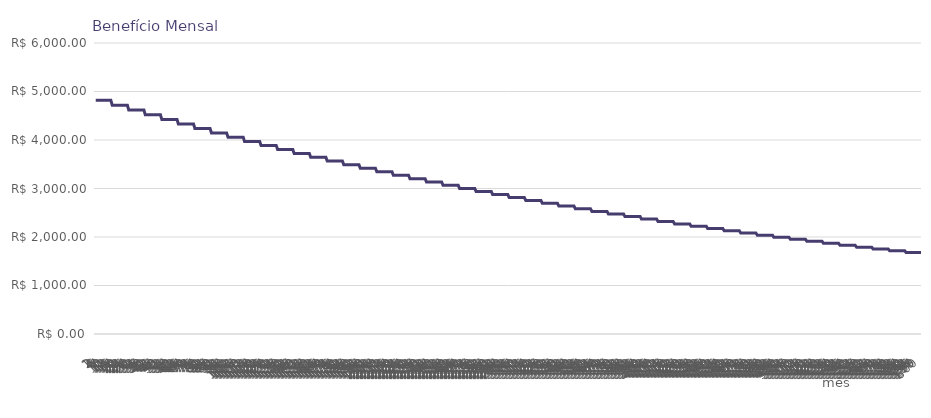
| Category | Series 0 |
|---|---|
| 0 | 4819.606 |
| 1 | 4819.606 |
| 2 | 4819.606 |
| 3 | 4819.606 |
| 4 | 4819.606 |
| 5 | 4819.606 |
| 6 | 4819.606 |
| 7 | 4819.606 |
| 8 | 4819.606 |
| 9 | 4819.606 |
| 10 | 4819.606 |
| 11 | 4819.606 |
| 12 | 4716.986 |
| 13 | 4716.986 |
| 14 | 4716.986 |
| 15 | 4716.986 |
| 16 | 4716.986 |
| 17 | 4716.986 |
| 18 | 4716.986 |
| 19 | 4716.986 |
| 20 | 4716.986 |
| 21 | 4716.986 |
| 22 | 4716.986 |
| 23 | 4716.986 |
| 24 | 4616.551 |
| 25 | 4616.551 |
| 26 | 4616.551 |
| 27 | 4616.551 |
| 28 | 4616.551 |
| 29 | 4616.551 |
| 30 | 4616.551 |
| 31 | 4616.551 |
| 32 | 4616.551 |
| 33 | 4616.551 |
| 34 | 4616.551 |
| 35 | 4616.551 |
| 36 | 4518.254 |
| 37 | 4518.254 |
| 38 | 4518.254 |
| 39 | 4518.254 |
| 40 | 4518.254 |
| 41 | 4518.254 |
| 42 | 4518.254 |
| 43 | 4518.254 |
| 44 | 4518.254 |
| 45 | 4518.254 |
| 46 | 4518.254 |
| 47 | 4518.254 |
| 48 | 4422.051 |
| 49 | 4422.051 |
| 50 | 4422.051 |
| 51 | 4422.051 |
| 52 | 4422.051 |
| 53 | 4422.051 |
| 54 | 4422.051 |
| 55 | 4422.051 |
| 56 | 4422.051 |
| 57 | 4422.051 |
| 58 | 4422.051 |
| 59 | 4422.051 |
| 60 | 4327.895 |
| 61 | 4327.895 |
| 62 | 4327.895 |
| 63 | 4327.895 |
| 64 | 4327.895 |
| 65 | 4327.895 |
| 66 | 4327.895 |
| 67 | 4327.895 |
| 68 | 4327.895 |
| 69 | 4327.895 |
| 70 | 4327.895 |
| 71 | 4327.895 |
| 72 | 4235.745 |
| 73 | 4235.745 |
| 74 | 4235.745 |
| 75 | 4235.745 |
| 76 | 4235.745 |
| 77 | 4235.745 |
| 78 | 4235.745 |
| 79 | 4235.745 |
| 80 | 4235.745 |
| 81 | 4235.745 |
| 82 | 4235.745 |
| 83 | 4235.745 |
| 84 | 4145.557 |
| 85 | 4145.557 |
| 86 | 4145.557 |
| 87 | 4145.557 |
| 88 | 4145.557 |
| 89 | 4145.557 |
| 90 | 4145.557 |
| 91 | 4145.557 |
| 92 | 4145.557 |
| 93 | 4145.557 |
| 94 | 4145.557 |
| 95 | 4145.557 |
| 96 | 4057.288 |
| 97 | 4057.288 |
| 98 | 4057.288 |
| 99 | 4057.288 |
| 100 | 4057.288 |
| 101 | 4057.288 |
| 102 | 4057.288 |
| 103 | 4057.288 |
| 104 | 4057.288 |
| 105 | 4057.288 |
| 106 | 4057.288 |
| 107 | 4057.288 |
| 108 | 3970.9 |
| 109 | 3970.9 |
| 110 | 3970.9 |
| 111 | 3970.9 |
| 112 | 3970.9 |
| 113 | 3970.9 |
| 114 | 3970.9 |
| 115 | 3970.9 |
| 116 | 3970.9 |
| 117 | 3970.9 |
| 118 | 3970.9 |
| 119 | 3970.9 |
| 120 | 3886.351 |
| 121 | 3886.351 |
| 122 | 3886.351 |
| 123 | 3886.351 |
| 124 | 3886.351 |
| 125 | 3886.351 |
| 126 | 3886.351 |
| 127 | 3886.351 |
| 128 | 3886.351 |
| 129 | 3886.351 |
| 130 | 3886.351 |
| 131 | 3886.351 |
| 132 | 3803.602 |
| 133 | 3803.602 |
| 134 | 3803.602 |
| 135 | 3803.602 |
| 136 | 3803.602 |
| 137 | 3803.602 |
| 138 | 3803.602 |
| 139 | 3803.602 |
| 140 | 3803.602 |
| 141 | 3803.602 |
| 142 | 3803.602 |
| 143 | 3803.602 |
| 144 | 3722.614 |
| 145 | 3722.614 |
| 146 | 3722.614 |
| 147 | 3722.614 |
| 148 | 3722.614 |
| 149 | 3722.614 |
| 150 | 3722.614 |
| 151 | 3722.614 |
| 152 | 3722.614 |
| 153 | 3722.614 |
| 154 | 3722.614 |
| 155 | 3722.614 |
| 156 | 3643.352 |
| 157 | 3643.352 |
| 158 | 3643.352 |
| 159 | 3643.352 |
| 160 | 3643.352 |
| 161 | 3643.352 |
| 162 | 3643.352 |
| 163 | 3643.352 |
| 164 | 3643.352 |
| 165 | 3643.352 |
| 166 | 3643.352 |
| 167 | 3643.352 |
| 168 | 3565.777 |
| 169 | 3565.777 |
| 170 | 3565.777 |
| 171 | 3565.777 |
| 172 | 3565.777 |
| 173 | 3565.777 |
| 174 | 3565.777 |
| 175 | 3565.777 |
| 176 | 3565.777 |
| 177 | 3565.777 |
| 178 | 3565.777 |
| 179 | 3565.777 |
| 180 | 3489.854 |
| 181 | 3489.854 |
| 182 | 3489.854 |
| 183 | 3489.854 |
| 184 | 3489.854 |
| 185 | 3489.854 |
| 186 | 3489.854 |
| 187 | 3489.854 |
| 188 | 3489.854 |
| 189 | 3489.854 |
| 190 | 3489.854 |
| 191 | 3489.854 |
| 192 | 3415.547 |
| 193 | 3415.547 |
| 194 | 3415.547 |
| 195 | 3415.547 |
| 196 | 3415.547 |
| 197 | 3415.547 |
| 198 | 3415.547 |
| 199 | 3415.547 |
| 200 | 3415.547 |
| 201 | 3415.547 |
| 202 | 3415.547 |
| 203 | 3415.547 |
| 204 | 3342.822 |
| 205 | 3342.822 |
| 206 | 3342.822 |
| 207 | 3342.822 |
| 208 | 3342.822 |
| 209 | 3342.822 |
| 210 | 3342.822 |
| 211 | 3342.822 |
| 212 | 3342.822 |
| 213 | 3342.822 |
| 214 | 3342.822 |
| 215 | 3342.822 |
| 216 | 3271.646 |
| 217 | 3271.646 |
| 218 | 3271.646 |
| 219 | 3271.646 |
| 220 | 3271.646 |
| 221 | 3271.646 |
| 222 | 3271.646 |
| 223 | 3271.646 |
| 224 | 3271.646 |
| 225 | 3271.646 |
| 226 | 3271.646 |
| 227 | 3271.646 |
| 228 | 3201.986 |
| 229 | 3201.986 |
| 230 | 3201.986 |
| 231 | 3201.986 |
| 232 | 3201.986 |
| 233 | 3201.986 |
| 234 | 3201.986 |
| 235 | 3201.986 |
| 236 | 3201.986 |
| 237 | 3201.986 |
| 238 | 3201.986 |
| 239 | 3201.986 |
| 240 | 3133.808 |
| 241 | 3133.808 |
| 242 | 3133.808 |
| 243 | 3133.808 |
| 244 | 3133.808 |
| 245 | 3133.808 |
| 246 | 3133.808 |
| 247 | 3133.808 |
| 248 | 3133.808 |
| 249 | 3133.808 |
| 250 | 3133.808 |
| 251 | 3133.808 |
| 252 | 3067.083 |
| 253 | 3067.083 |
| 254 | 3067.083 |
| 255 | 3067.083 |
| 256 | 3067.083 |
| 257 | 3067.083 |
| 258 | 3067.083 |
| 259 | 3067.083 |
| 260 | 3067.083 |
| 261 | 3067.083 |
| 262 | 3067.083 |
| 263 | 3067.083 |
| 264 | 3001.778 |
| 265 | 3001.778 |
| 266 | 3001.778 |
| 267 | 3001.778 |
| 268 | 3001.778 |
| 269 | 3001.778 |
| 270 | 3001.778 |
| 271 | 3001.778 |
| 272 | 3001.778 |
| 273 | 3001.778 |
| 274 | 3001.778 |
| 275 | 3001.778 |
| 276 | 2937.863 |
| 277 | 2937.863 |
| 278 | 2937.863 |
| 279 | 2937.863 |
| 280 | 2937.863 |
| 281 | 2937.863 |
| 282 | 2937.863 |
| 283 | 2937.863 |
| 284 | 2937.863 |
| 285 | 2937.863 |
| 286 | 2937.863 |
| 287 | 2937.863 |
| 288 | 2875.31 |
| 289 | 2875.31 |
| 290 | 2875.31 |
| 291 | 2875.31 |
| 292 | 2875.31 |
| 293 | 2875.31 |
| 294 | 2875.31 |
| 295 | 2875.31 |
| 296 | 2875.31 |
| 297 | 2875.31 |
| 298 | 2875.31 |
| 299 | 2875.31 |
| 300 | 2814.088 |
| 301 | 2814.088 |
| 302 | 2814.088 |
| 303 | 2814.088 |
| 304 | 2814.088 |
| 305 | 2814.088 |
| 306 | 2814.088 |
| 307 | 2814.088 |
| 308 | 2814.088 |
| 309 | 2814.088 |
| 310 | 2814.088 |
| 311 | 2814.088 |
| 312 | 2754.17 |
| 313 | 2754.17 |
| 314 | 2754.17 |
| 315 | 2754.17 |
| 316 | 2754.17 |
| 317 | 2754.17 |
| 318 | 2754.17 |
| 319 | 2754.17 |
| 320 | 2754.17 |
| 321 | 2754.17 |
| 322 | 2754.17 |
| 323 | 2754.17 |
| 324 | 2695.527 |
| 325 | 2695.527 |
| 326 | 2695.527 |
| 327 | 2695.527 |
| 328 | 2695.527 |
| 329 | 2695.527 |
| 330 | 2695.527 |
| 331 | 2695.527 |
| 332 | 2695.527 |
| 333 | 2695.527 |
| 334 | 2695.527 |
| 335 | 2695.527 |
| 336 | 2638.134 |
| 337 | 2638.134 |
| 338 | 2638.134 |
| 339 | 2638.134 |
| 340 | 2638.134 |
| 341 | 2638.134 |
| 342 | 2638.134 |
| 343 | 2638.134 |
| 344 | 2638.134 |
| 345 | 2638.134 |
| 346 | 2638.134 |
| 347 | 2638.134 |
| 348 | 2581.962 |
| 349 | 2581.962 |
| 350 | 2581.962 |
| 351 | 2581.962 |
| 352 | 2581.962 |
| 353 | 2581.962 |
| 354 | 2581.962 |
| 355 | 2581.962 |
| 356 | 2581.962 |
| 357 | 2581.962 |
| 358 | 2581.962 |
| 359 | 2581.962 |
| 360 | 2526.986 |
| 361 | 2526.986 |
| 362 | 2526.986 |
| 363 | 2526.986 |
| 364 | 2526.986 |
| 365 | 2526.986 |
| 366 | 2526.986 |
| 367 | 2526.986 |
| 368 | 2526.986 |
| 369 | 2526.986 |
| 370 | 2526.986 |
| 371 | 2526.986 |
| 372 | 2473.181 |
| 373 | 2473.181 |
| 374 | 2473.181 |
| 375 | 2473.181 |
| 376 | 2473.181 |
| 377 | 2473.181 |
| 378 | 2473.181 |
| 379 | 2473.181 |
| 380 | 2473.181 |
| 381 | 2473.181 |
| 382 | 2473.181 |
| 383 | 2473.181 |
| 384 | 2420.522 |
| 385 | 2420.522 |
| 386 | 2420.522 |
| 387 | 2420.522 |
| 388 | 2420.522 |
| 389 | 2420.522 |
| 390 | 2420.522 |
| 391 | 2420.522 |
| 392 | 2420.522 |
| 393 | 2420.522 |
| 394 | 2420.522 |
| 395 | 2420.522 |
| 396 | 2368.983 |
| 397 | 2368.983 |
| 398 | 2368.983 |
| 399 | 2368.983 |
| 400 | 2368.983 |
| 401 | 2368.983 |
| 402 | 2368.983 |
| 403 | 2368.983 |
| 404 | 2368.983 |
| 405 | 2368.983 |
| 406 | 2368.983 |
| 407 | 2368.983 |
| 408 | 2318.542 |
| 409 | 2318.542 |
| 410 | 2318.542 |
| 411 | 2318.542 |
| 412 | 2318.542 |
| 413 | 2318.542 |
| 414 | 2318.542 |
| 415 | 2318.542 |
| 416 | 2318.542 |
| 417 | 2318.542 |
| 418 | 2318.542 |
| 419 | 2318.542 |
| 420 | 2269.176 |
| 421 | 2269.176 |
| 422 | 2269.176 |
| 423 | 2269.176 |
| 424 | 2269.176 |
| 425 | 2269.176 |
| 426 | 2269.176 |
| 427 | 2269.176 |
| 428 | 2269.176 |
| 429 | 2269.176 |
| 430 | 2269.176 |
| 431 | 2269.176 |
| 432 | 2220.86 |
| 433 | 2220.86 |
| 434 | 2220.86 |
| 435 | 2220.86 |
| 436 | 2220.86 |
| 437 | 2220.86 |
| 438 | 2220.86 |
| 439 | 2220.86 |
| 440 | 2220.86 |
| 441 | 2220.86 |
| 442 | 2220.86 |
| 443 | 2220.86 |
| 444 | 2173.573 |
| 445 | 2173.573 |
| 446 | 2173.573 |
| 447 | 2173.573 |
| 448 | 2173.573 |
| 449 | 2173.573 |
| 450 | 2173.573 |
| 451 | 2173.573 |
| 452 | 2173.573 |
| 453 | 2173.573 |
| 454 | 2173.573 |
| 455 | 2173.573 |
| 456 | 2127.293 |
| 457 | 2127.293 |
| 458 | 2127.293 |
| 459 | 2127.293 |
| 460 | 2127.293 |
| 461 | 2127.293 |
| 462 | 2127.293 |
| 463 | 2127.293 |
| 464 | 2127.293 |
| 465 | 2127.293 |
| 466 | 2127.293 |
| 467 | 2127.293 |
| 468 | 2081.998 |
| 469 | 2081.998 |
| 470 | 2081.998 |
| 471 | 2081.998 |
| 472 | 2081.998 |
| 473 | 2081.998 |
| 474 | 2081.998 |
| 475 | 2081.998 |
| 476 | 2081.998 |
| 477 | 2081.998 |
| 478 | 2081.998 |
| 479 | 2081.998 |
| 480 | 2037.668 |
| 481 | 2037.668 |
| 482 | 2037.668 |
| 483 | 2037.668 |
| 484 | 2037.668 |
| 485 | 2037.668 |
| 486 | 2037.668 |
| 487 | 2037.668 |
| 488 | 2037.668 |
| 489 | 2037.668 |
| 490 | 2037.668 |
| 491 | 2037.668 |
| 492 | 1994.281 |
| 493 | 1994.281 |
| 494 | 1994.281 |
| 495 | 1994.281 |
| 496 | 1994.281 |
| 497 | 1994.281 |
| 498 | 1994.281 |
| 499 | 1994.281 |
| 500 | 1994.281 |
| 501 | 1994.281 |
| 502 | 1994.281 |
| 503 | 1994.281 |
| 504 | 1951.818 |
| 505 | 1951.818 |
| 506 | 1951.818 |
| 507 | 1951.818 |
| 508 | 1951.818 |
| 509 | 1951.818 |
| 510 | 1951.818 |
| 511 | 1951.818 |
| 512 | 1951.818 |
| 513 | 1951.818 |
| 514 | 1951.818 |
| 515 | 1951.818 |
| 516 | 1910.26 |
| 517 | 1910.26 |
| 518 | 1910.26 |
| 519 | 1910.26 |
| 520 | 1910.26 |
| 521 | 1910.26 |
| 522 | 1910.26 |
| 523 | 1910.26 |
| 524 | 1910.26 |
| 525 | 1910.26 |
| 526 | 1910.26 |
| 527 | 1910.26 |
| 528 | 1869.586 |
| 529 | 1869.586 |
| 530 | 1869.586 |
| 531 | 1869.586 |
| 532 | 1869.586 |
| 533 | 1869.586 |
| 534 | 1869.586 |
| 535 | 1869.586 |
| 536 | 1869.586 |
| 537 | 1869.586 |
| 538 | 1869.586 |
| 539 | 1869.586 |
| 540 | 1829.779 |
| 541 | 1829.779 |
| 542 | 1829.779 |
| 543 | 1829.779 |
| 544 | 1829.779 |
| 545 | 1829.779 |
| 546 | 1829.779 |
| 547 | 1829.779 |
| 548 | 1829.779 |
| 549 | 1829.779 |
| 550 | 1829.779 |
| 551 | 1829.779 |
| 552 | 1790.819 |
| 553 | 1790.819 |
| 554 | 1790.819 |
| 555 | 1790.819 |
| 556 | 1790.819 |
| 557 | 1790.819 |
| 558 | 1790.819 |
| 559 | 1790.819 |
| 560 | 1790.819 |
| 561 | 1790.819 |
| 562 | 1790.819 |
| 563 | 1790.819 |
| 564 | 1752.688 |
| 565 | 1752.688 |
| 566 | 1752.688 |
| 567 | 1752.688 |
| 568 | 1752.688 |
| 569 | 1752.688 |
| 570 | 1752.688 |
| 571 | 1752.688 |
| 572 | 1752.688 |
| 573 | 1752.688 |
| 574 | 1752.688 |
| 575 | 1752.688 |
| 576 | 1715.369 |
| 577 | 1715.369 |
| 578 | 1715.369 |
| 579 | 1715.369 |
| 580 | 1715.369 |
| 581 | 1715.369 |
| 582 | 1715.369 |
| 583 | 1715.369 |
| 584 | 1715.369 |
| 585 | 1715.369 |
| 586 | 1715.369 |
| 587 | 1715.369 |
| 588 | 1678.845 |
| 589 | 1678.845 |
| 590 | 1678.845 |
| 591 | 1678.845 |
| 592 | 1678.845 |
| 593 | 1678.845 |
| 594 | 1678.845 |
| 595 | 1678.845 |
| 596 | 1678.845 |
| 597 | 1678.845 |
| 598 | 1678.845 |
| 599 | 1678.845 |